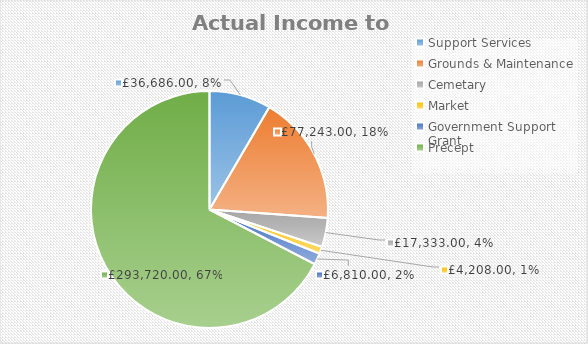
| Category | Series 0 |
|---|---|
| Support Services | 36686 |
| Grounds & Maintenance | 77243 |
| Cemetary | 17333 |
| Market   | 4208 |
| Government Support Grant | 6810 |
| Precept | 293720 |